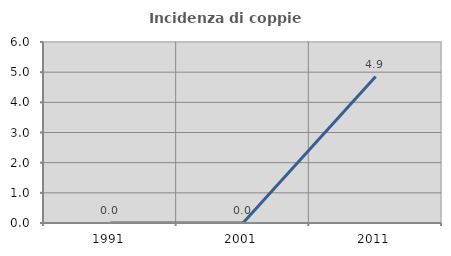
| Category | Incidenza di coppie miste |
|---|---|
| 1991.0 | 0 |
| 2001.0 | 0 |
| 2011.0 | 4.854 |